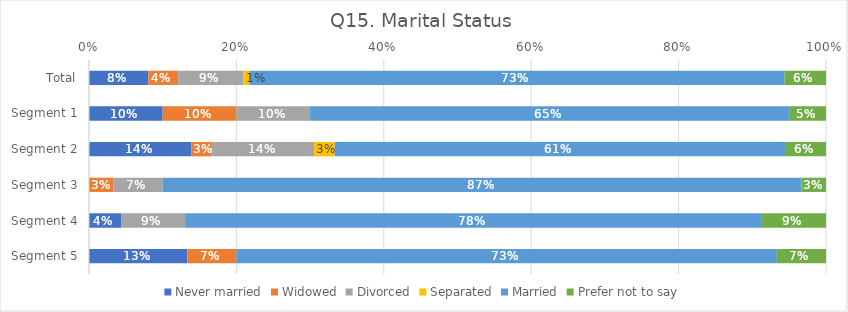
| Category | Never married | Widowed | Divorced | Separated | Married | Prefer not to say |
|---|---|---|---|---|---|---|
| Total | 0.081 | 0.04 | 0.089 | 0.008 | 0.726 | 0.056 |
| Segment 1 | 0.1 | 0.1 | 0.1 | 0 | 0.65 | 0.05 |
| Segment 2 | 0.139 | 0.028 | 0.139 | 0.028 | 0.611 | 0.056 |
| Segment 3 | 0 | 0.033 | 0.067 | 0 | 0.867 | 0.033 |
| Segment 4 | 0.043 | 0 | 0.087 | 0 | 0.783 | 0.087 |
| Segment 5 | 0.133 | 0.067 | 0 | 0 | 0.733 | 0.067 |